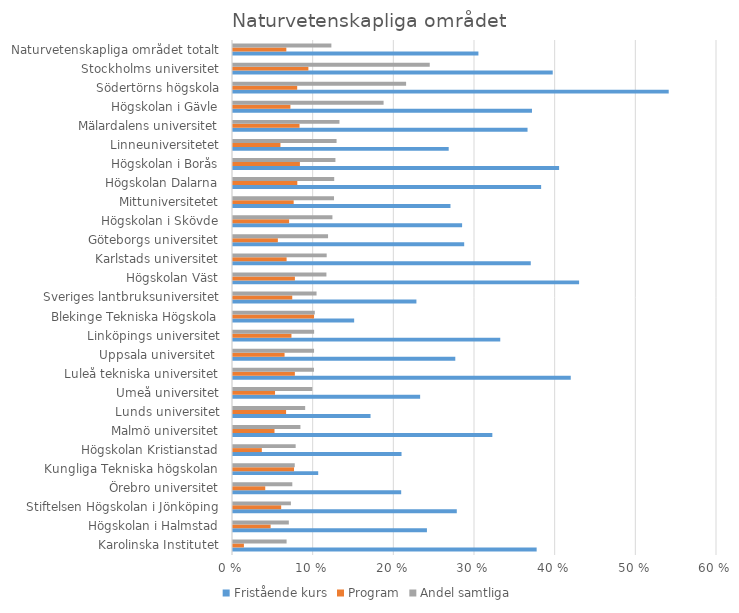
| Category | Fristående kurs | Program | Andel samtliga |
|---|---|---|---|
| Karolinska Institutet | 0.376 | 0.014 | 0.066 |
| Högskolan i Halmstad | 0.24 | 0.047 | 0.069 |
| Stiftelsen Högskolan i Jönköping | 0.277 | 0.06 | 0.072 |
| Örebro universitet | 0.208 | 0.04 | 0.074 |
| Kungliga Tekniska högskolan | 0.106 | 0.076 | 0.077 |
| Högskolan Kristianstad | 0.209 | 0.036 | 0.078 |
| Malmö universitet | 0.321 | 0.051 | 0.084 |
| Lunds universitet | 0.17 | 0.066 | 0.089 |
| Umeå universitet | 0.232 | 0.052 | 0.098 |
| Luleå tekniska universitet | 0.419 | 0.077 | 0.1 |
| Uppsala universitet  | 0.276 | 0.064 | 0.1 |
| Linköpings universitet | 0.331 | 0.072 | 0.101 |
| Blekinge Tekniska Högskola | 0.15 | 0.1 | 0.101 |
| Sveriges lantbruksuniversitet | 0.227 | 0.073 | 0.104 |
| Högskolan Väst | 0.429 | 0.077 | 0.116 |
| Karlstads universitet | 0.369 | 0.066 | 0.116 |
| Göteborgs universitet | 0.287 | 0.056 | 0.118 |
| Högskolan i Skövde | 0.284 | 0.07 | 0.123 |
| Mittuniversitetet | 0.27 | 0.075 | 0.125 |
| Högskolan Dalarna | 0.382 | 0.08 | 0.125 |
| Högskolan i Borås | 0.404 | 0.083 | 0.127 |
| Linneuniversitetet | 0.267 | 0.059 | 0.128 |
| Mälardalens universitet | 0.365 | 0.082 | 0.132 |
| Högskolan i Gävle | 0.371 | 0.071 | 0.187 |
| Södertörns högskola | 0.54 | 0.08 | 0.215 |
| Stockholms universitet | 0.396 | 0.093 | 0.244 |
| Naturvetenskapliga området totalt | 0.304 | 0.066 | 0.122 |